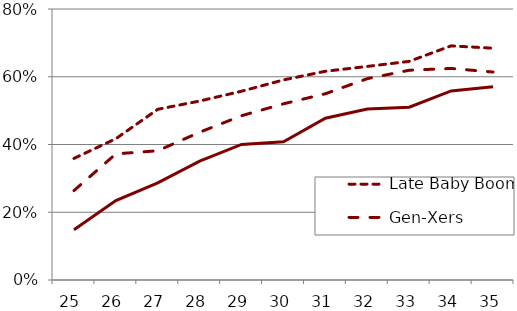
| Category | Late Baby Boomers | Gen-Xers | Millennials |
|---|---|---|---|
| 25.0 | 0.359 | 0.264 | 0.149 |
| 26.0 | 0.417 | 0.372 | 0.234 |
| 27.0 | 0.504 | 0.382 | 0.287 |
| 28.0 | 0.528 | 0.436 | 0.351 |
| 29.0 | 0.557 | 0.485 | 0.4 |
| 30.0 | 0.591 | 0.52 | 0.408 |
| 31.0 | 0.616 | 0.55 | 0.478 |
| 32.0 | 0.63 | 0.594 | 0.505 |
| 33.0 | 0.645 | 0.619 | 0.51 |
| 34.0 | 0.691 | 0.625 | 0.558 |
| 35.0 | 0.684 | 0.614 | 0.571 |